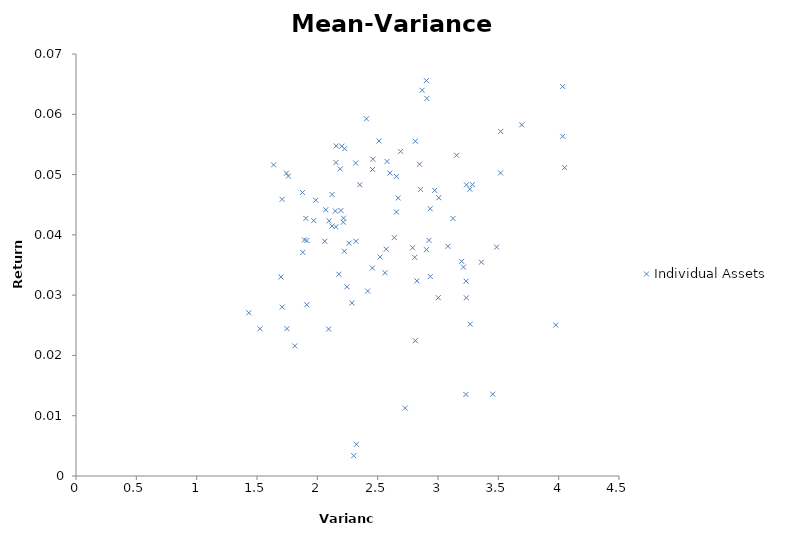
| Category | Individual Assets |
|---|---|
| 2.301397894714443 | 0.003 |
| 2.154001513576188 | 0.041 |
| 1.8928040093858 | 0.039 |
| 1.879435385924119 | 0.037 |
| 1.760227607185388 | 0.05 |
| 1.697925493849911 | 0.033 |
| 1.812824023075418 | 0.022 |
| 1.912165060398107 | 0.028 |
| 2.093774835000036 | 0.024 |
| 2.323605729393115 | 0.005 |
| 3.97583096339251 | 0.025 |
| 4.033804234421559 | 0.056 |
| 3.264517304911251 | 0.048 |
| 3.485730074150734 | 0.038 |
| 3.28547169511712 | 0.048 |
| 3.518254865246324 | 0.05 |
| 3.234995356181886 | 0.03 |
| 3.235600024890208 | 0.048 |
| 3.082278973074458 | 0.038 |
| 3.453881086598998 | 0.014 |
| 4.033609843270524 | 0.065 |
| 3.693953043850851 | 0.058 |
| 2.812199963704426 | 0.056 |
| 2.80736829555693 | 0.036 |
| 2.972683510069502 | 0.047 |
| 2.868114640336627 | 0.064 |
| 2.925169995636344 | 0.039 |
| 2.907495517810666 | 0.063 |
| 2.904344301388815 | 0.038 |
| 3.359475774195484 | 0.035 |
| 4.048787034395734 | 0.051 |
| 3.231193294391197 | 0.014 |
| 3.196109679704101 | 0.036 |
| 2.577872737843196 | 0.052 |
| 2.690284881503744 | 0.054 |
| 2.65526592296957 | 0.044 |
| 2.511437704304434 | 0.056 |
| 2.935845679486687 | 0.044 |
| 2.669770887902743 | 0.046 |
| 2.936470557036366 | 0.033 |
| 3.519265683409256 | 0.057 |
| 2.903629195117107 | 0.066 |
| 2.825337715016651 | 0.032 |
| 2.846696994256362 | 0.052 |
| 2.406912458316798 | 0.059 |
| 2.460773419724378 | 0.053 |
| 2.223943660166869 | 0.037 |
| 2.854948728646455 | 0.048 |
| 2.570634641470855 | 0.038 |
| 3.266310011767722 | 0.025 |
| 2.789341393961445 | 0.038 |
| 2.560858915653741 | 0.034 |
| 2.22650320396731 | 0.054 |
| 2.203061840724784 | 0.055 |
| 2.154806804145633 | 0.052 |
| 2.189988689373465 | 0.051 |
| 2.148802474904997 | 0.044 |
| 2.601032575284986 | 0.05 |
| 2.155941422191349 | 0.055 |
| 3.006350780670074 | 0.046 |
| 2.728375381954283 | 0.011 |
| 2.195699037725978 | 0.044 |
| 2.215356329971581 | 0.042 |
| 1.98671862339869 | 0.046 |
| 2.637458151760913 | 0.04 |
| 1.876345691727008 | 0.047 |
| 2.351826491600342 | 0.048 |
| 2.244651338572872 | 0.031 |
| 2.456255021692284 | 0.035 |
| 3.124471586167335 | 0.043 |
| 3.002381598124122 | 0.03 |
| 2.654780012838928 | 0.05 |
| 2.319842170913759 | 0.039 |
| 2.520844589122685 | 0.036 |
| 1.744066602251459 | 0.05 |
| 2.070084100833667 | 0.044 |
| 2.217290044408521 | 0.043 |
| 2.121597735921284 | 0.041 |
| 2.457750052678991 | 0.051 |
| 3.232699531418352 | 0.032 |
| 2.286369187256207 | 0.029 |
| 2.178607327028861 | 0.033 |
| 1.970001549871761 | 0.042 |
| 1.707708928571436 | 0.046 |
| 1.63756794715716 | 0.052 |
| 2.317289203702651 | 0.052 |
| 1.912790738813588 | 0.039 |
| 2.4168396400058 | 0.031 |
| 2.811904780556675 | 0.022 |
| 3.210602741765742 | 0.035 |
| 2.122579581072731 | 0.047 |
| 3.154103873277385 | 0.053 |
| 1.524469140799752 | 0.024 |
| 1.708772957270776 | 0.028 |
| 2.097026846616488 | 0.042 |
| 1.432355754535369 | 0.027 |
| 1.748142675601945 | 0.024 |
| 2.262085355725064 | 0.039 |
| 1.904735774715338 | 0.043 |
| 2.061486936173952 | 0.039 |